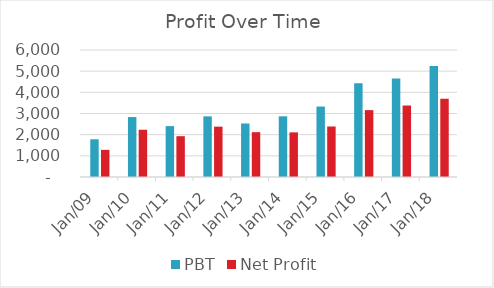
| Category | PBT | Net Profit |
|---|---|---|
| Mar-09 | 1781.46 | 1281.76 |
| Mar-10 | 2831.73 | 2231.83 |
| Mar-11 | 2404.76 | 1927.9 |
| Mar-12 | 2864.71 | 2378.13 |
| Mar-13 | 2529.2 | 2118.16 |
| Mar-14 | 2867.25 | 2109.08 |
| Mar-15 | 3328.82 | 2385.64 |
| Mar-16 | 4434.87 | 3160.19 |
| Mar-17 | 4658.46 | 3377.12 |
| Mar-18 | 5244.16 | 3697.36 |